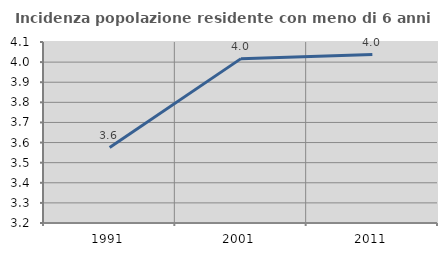
| Category | Incidenza popolazione residente con meno di 6 anni |
|---|---|
| 1991.0 | 3.575 |
| 2001.0 | 4.017 |
| 2011.0 | 4.037 |